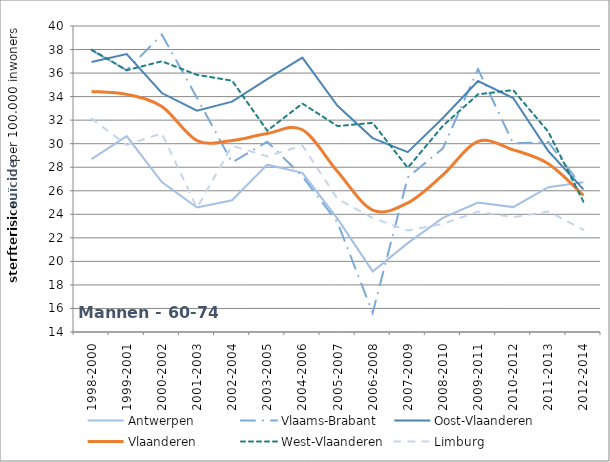
| Category | Antwerpen | Vlaams-Brabant | Oost-Vlaanderen | Vlaanderen | West-Vlaanderen | Limburg |
|---|---|---|---|---|---|---|
| 1998-2000 | 28.682 | 37.943 | 36.948 | 34.438 | 37.988 | 32.13 |
| 1999-2001 | 30.638 | 36.233 | 37.621 | 34.193 | 36.245 | 29.898 |
| 2000-2002 | 26.739 | 39.271 | 34.305 | 33.152 | 37.001 | 30.886 |
| 2001-2003 | 24.574 | 33.897 | 32.8 | 30.266 | 35.852 | 24.541 |
| 2002-2004 | 25.194 | 28.404 | 33.576 | 30.269 | 35.355 | 29.827 |
| 2003-2005 | 28.218 | 30.173 | 35.491 | 30.858 | 31.101 | 28.926 |
| 2004-2006 | 27.519 | 27.226 | 37.319 | 31.184 | 33.411 | 29.853 |
| 2005-2007 | 23.627 | 23.32 | 33.219 | 27.64 | 31.498 | 25.309 |
| 2006-2008 | 19.147 | 15.621 | 30.478 | 24.359 | 31.771 | 23.688 |
| 2007-2009 | 21.551 | 27.137 | 29.282 | 24.975 | 27.951 | 22.618 |
| 2008-2010 | 23.7 | 29.607 | 32.18 | 27.348 | 31.519 | 23.191 |
| 2009-2011 | 24.993 | 36.338 | 35.32 | 30.192 | 34.195 | 24.225 |
| 2010-2012 | 24.612 | 30.029 | 33.877 | 29.479 | 34.558 | 23.753 |
| 2011-2013 | 26.308 | 30.138 | 29.378 | 28.296 | 31.008 | 24.237 |
| 2012-2014 | 26.728 | 26.198 | 26.121 | 25.616 | 25.069 | 22.689 |